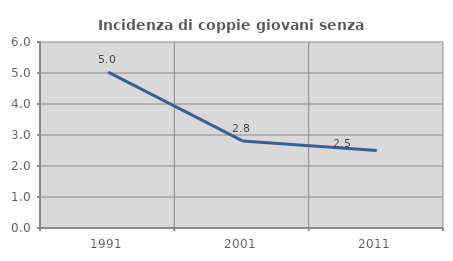
| Category | Incidenza di coppie giovani senza figli |
|---|---|
| 1991.0 | 5.026 |
| 2001.0 | 2.808 |
| 2011.0 | 2.5 |